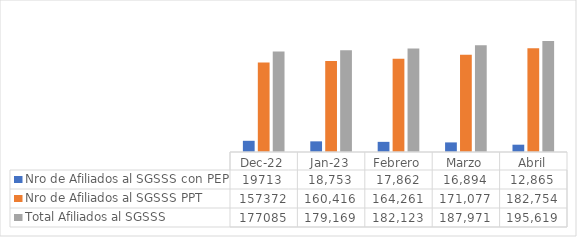
| Category | Nro de Afiliados al SGSSS con PEP | Nro de Afiliados al SGSSS PPT | Total Afiliados al SGSSS |
|---|---|---|---|
| dic-22 | 19713 | 157372 | 177085 |
| ene-23 | 18753 | 160416 | 179169 |
| Febrero | 17862 | 164261 | 182123 |
| Marzo | 16894 | 171077 | 187971 |
| Abril | 12865 | 182754 | 195619 |